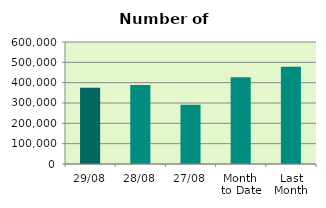
| Category | Series 0 |
|---|---|
| 29/08 | 374576 |
| 28/08 | 389092 |
| 27/08 | 291786 |
| Month 
to Date | 426580.952 |
| Last
Month | 477777.545 |